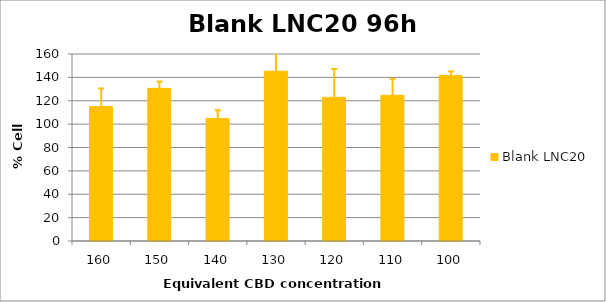
| Category | Blank LNC20 |
|---|---|
| 160.0 | 115.028 |
| 150.0 | 130.615 |
| 140.0 | 104.887 |
| 130.0 | 145.293 |
| 120.0 | 122.926 |
| 110.0 | 124.657 |
| 100.0 | 141.543 |